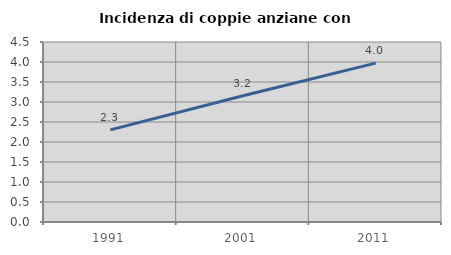
| Category | Incidenza di coppie anziane con figli |
|---|---|
| 1991.0 | 2.304 |
| 2001.0 | 3.158 |
| 2011.0 | 3.972 |